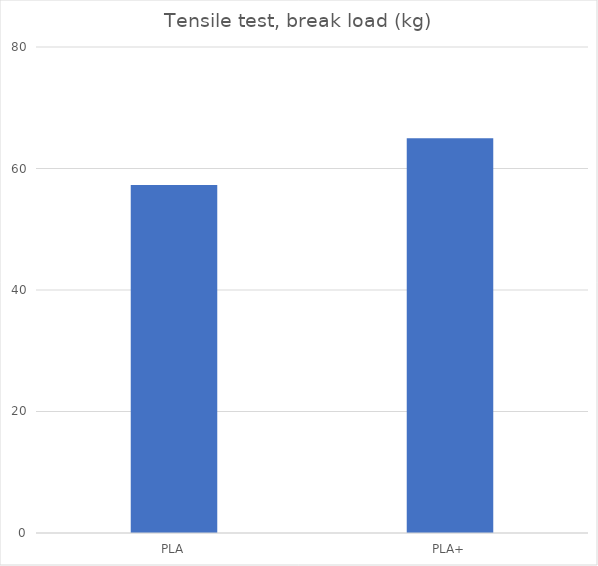
| Category | Average (kg) |
|---|---|
| PLA | 57.3 |
| PLA+ | 65 |